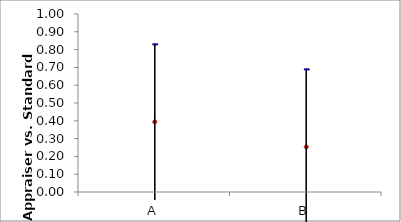
| Category | Fleiss' Kappa_x000d_P-Value | Fleiss' Kappa 95.0% LC |
|---|---|---|
| A | -0.044 | 0.832 |
| B | -0.185 | 0.692 |